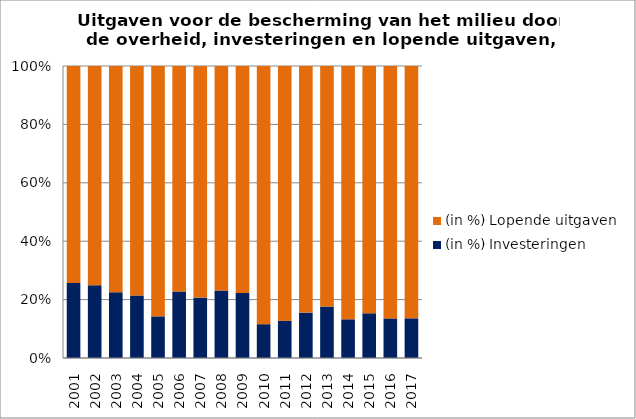
| Category | (in %) |
|---|---|
| 2001 | 74.315 |
| 2002 | 75.123 |
| 2003 | 77.466 |
| 2004 | 78.589 |
| 2005 | 85.742 |
| 2006 | 77.25 |
| 2007 | 79.316 |
| 2008 | 76.926 |
| 2009 | 77.768 |
| 2010 | 88.415 |
| 2011 | 87.212 |
| 2012 | 84.449 |
| 2013 | 82.379 |
| 2014 | 86.745 |
| 2015 | 84.68 |
| 2016 | 86.435 |
| 2017 | 86.411 |